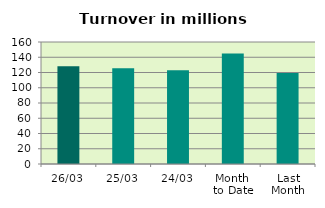
| Category | Series 0 |
|---|---|
| 26/03 | 128.037 |
| 25/03 | 125.455 |
| 24/03 | 123.089 |
| Month 
to Date | 144.972 |
| Last
Month | 119.242 |